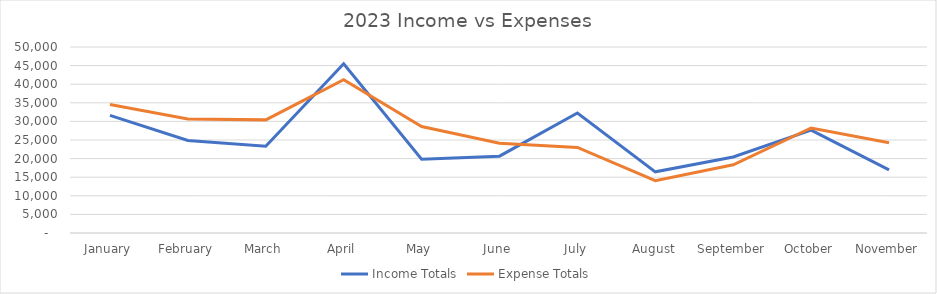
| Category | Income Totals | Expense Totals |
|---|---|---|
| January | 31606 | 34551 |
| February | 24880 | 30673 |
| March | 23320 | 30411 |
| April | 45486 | 41198 |
| May | 19824 | 28620 |
| June | 20649 | 24130 |
| July | 32274 | 23014 |
| August | 16445 | 14055 |
| September | 20426 | 18351 |
| October | 27676 | 28231 |
| November | 16988 | 24268 |